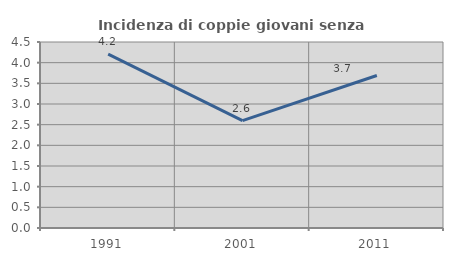
| Category | Incidenza di coppie giovani senza figli |
|---|---|
| 1991.0 | 4.205 |
| 2001.0 | 2.599 |
| 2011.0 | 3.689 |